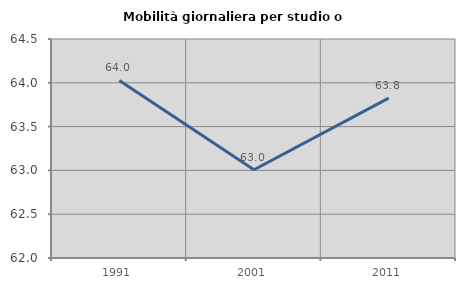
| Category | Mobilità giornaliera per studio o lavoro |
|---|---|
| 1991.0 | 64.027 |
| 2001.0 | 63.008 |
| 2011.0 | 63.825 |